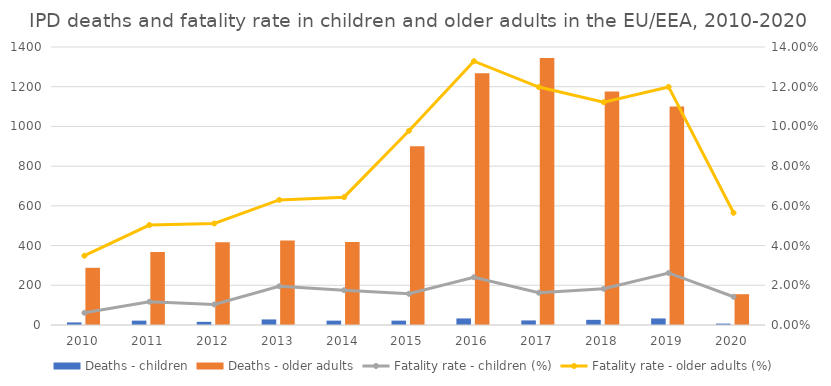
| Category | Deaths - children | Deaths - older adults |
|---|---|---|
| 2010.0 | 13 | 288 |
| 2011.0 | 22 | 367 |
| 2012.0 | 16 | 417 |
| 2013.0 | 28 | 425 |
| 2014.0 | 22 | 418 |
| 2015.0 | 22 | 900 |
| 2016.0 | 33 | 1268 |
| 2017.0 | 23 | 1345 |
| 2018.0 | 26 | 1176 |
| 2019.0 | 33 | 1100 |
| 2020.0 | 7 | 155 |